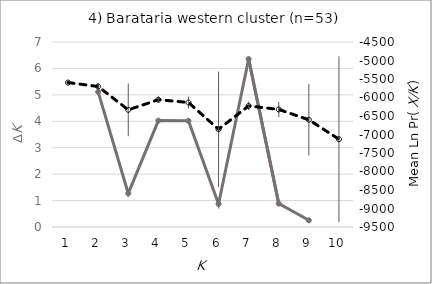
| Category | Evanno's ΔK |
|---|---|
| 0 | 0 |
| 1 | 5.112 |
| 2 | 1.271 |
| 3 | 4.026 |
| 4 | 4.018 |
| 5 | 0.871 |
| 6 | 6.354 |
| 7 | 0.885 |
| 8 | 0.254 |
| 9 | 0 |